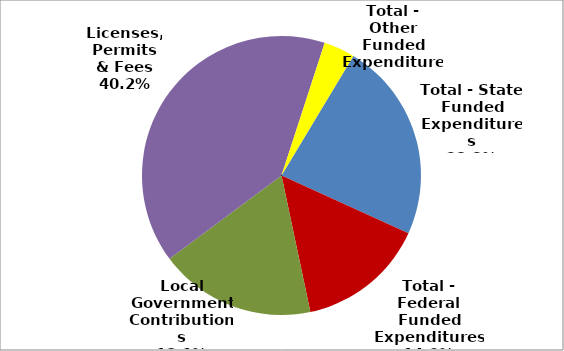
| Category | Series 0 |
|---|---|
| Total - State Funded Expenditures | 6877769 |
| Total - Federal Funded Expenditures | 4409737 |
| Local Government Contributions | 5380810 |
| Licenses, Permits & Fees | 11916225 |
| Total - Other Funded Expenditures | 1066824 |